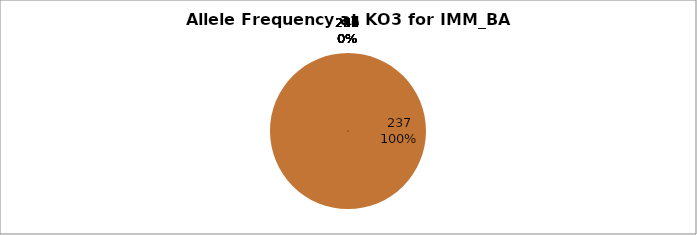
| Category | Series 0 |
|---|---|
| 218.0 | 0 |
| 224.0 | 0 |
| 227.0 | 0 |
| 235.0 | 0 |
| 236.0 | 0 |
| 237.0 | 1 |
| 238.0 | 0 |
| 239.0 | 0 |
| 240.0 | 0 |
| 241.0 | 0 |
| 247.0 | 0 |
| 249.0 | 0 |
| 250.0 | 0 |
| 251.0 | 0 |
| 252.0 | 0 |
| 254.0 | 0 |
| 255.0 | 0 |
| 256.0 | 0 |
| 257.0 | 0 |